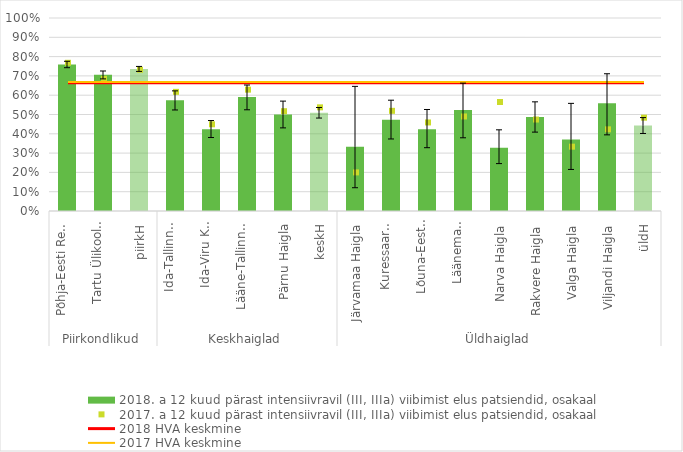
| Category | 2018. a 12 kuud pärast intensiivravil (III, IIIa) viibimist elus patsiendid, osakaal |
|---|---|
| 0 | 0.76 |
| 1 | 0.705 |
| 2 | 0.736 |
| 3 | 0.574 |
| 4 | 0.424 |
| 5 | 0.59 |
| 6 | 0.5 |
| 7 | 0.509 |
| 8 | 0.333 |
| 9 | 0.473 |
| 10 | 0.424 |
| 11 | 0.523 |
| 12 | 0.327 |
| 13 | 0.487 |
| 14 | 0.37 |
| 15 | 0.559 |
| 16 | 0.442 |